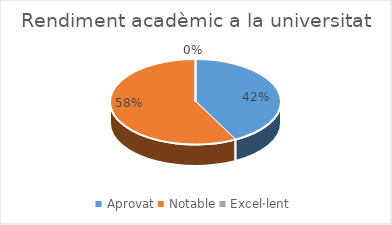
| Category | Series 0 |
|---|---|
| Aprovat | 11 |
| Notable | 15 |
| Excel·lent | 0 |